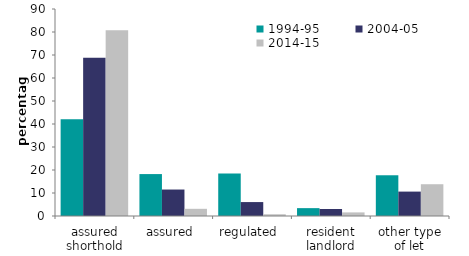
| Category | 1994-95 | 2004-05 | 2014-15 |
|---|---|---|---|
| assured shorthold | 42.117 | 68.773 | 80.744 |
| assured  | 18.227 | 11.508 | 3.123 |
| regulated  | 18.527 | 6.056 | 0.758 |
| resident landlord | 3.417 | 3.052 | 1.562 |
| other type of let | 17.711 | 10.61 | 13.813 |